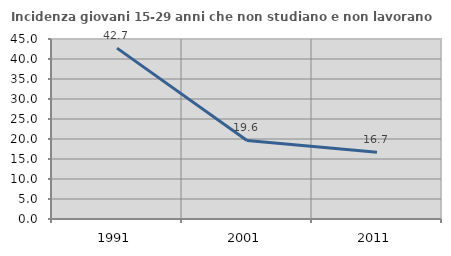
| Category | Incidenza giovani 15-29 anni che non studiano e non lavorano  |
|---|---|
| 1991.0 | 42.722 |
| 2001.0 | 19.643 |
| 2011.0 | 16.667 |